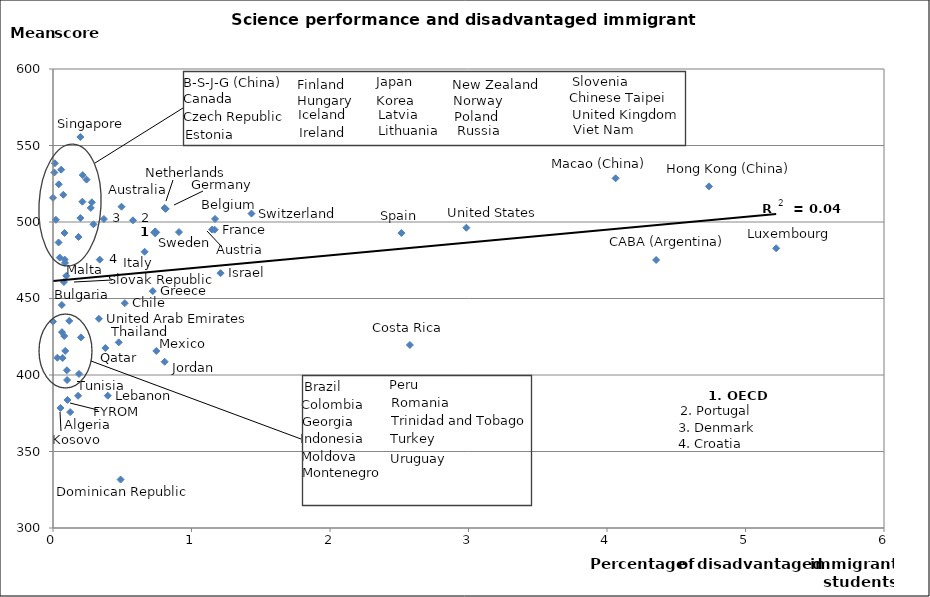
| Category | Series 0 |
|---|---|
| 0.7381021138976486 | 493.202 |
| 4.35471046002874 | 475.187 |
| 2.5767576199304703 | 419.608 |
| 0.9095095076684601 | 493.422 |
| 0.06359937555044999 | 445.772 |
| 0.0 | 434.898 |
| 0.80623082235673 | 408.669 |
| 5.22148431821229 | 482.806 |
| 0.04176187090346 | 524.645 |
| 0.11736489298019999 | 435.363 |
| 0.020934362074009998 | 501.435 |
| 2.9844963956779 | 496.242 |
| 0.29222999618618 | 498.481 |
| 0.51858185506878 | 446.956 |
| 0.36761572163273 | 501.937 |
| 0.04852194694502 | 476.748 |
| 0.66143154133983 | 480.547 |
| 0.08280448093446 | 492.83 |
| 0.49473007744346 | 509.994 |
| 0.07437952162546 | 517.779 |
| 0.08122676642809999 | 425.49 |
| 0.06970216039591 | 411.132 |
| 0.00965815717508 | 532.347 |
| 0.74584816593733 | 415.71 |
| 0.57730181029622 | 501.1 |
| 0.08677356591692001 | 473.23 |
| 0.04017116998308 | 486.631 |
| 0.0 | 515.81 |
| 4.73608688012086 | 523.277 |
| 0.37821854099259 | 417.611 |
| 0.013530713437959998 | 538.395 |
| 1.1700713989834801 | 502 |
| 1.20983840891144 | 466.553 |
| 0.20161467815215 | 424.59 |
| 0.33719584344535003 | 475.391 |
| 0.08414910997898 | 475.409 |
| 0.10459900304424 | 383.682 |
| 0.33158588221089 | 436.731 |
| 0.03144474262489 | 411.314 |
| 0.12379241536725 | 375.745 |
| 0.19766707392210003 | 502.575 |
| 0.10035803336328 | 403.1 |
| 0.7205082191152701 | 454.829 |
| 0.21214077397373998 | 513.304 |
| 0.0884296790826 | 415.729 |
| 0.18108866019997 | 386.403 |
| 0.1018179314471 | 396.684 |
| 4.06195384054908 | 528.55 |
| 2.51554867279658 | 492.786 |
| 1.43298755009549 | 505.506 |
| 0.09540810330846 | 464.782 |
| 0.05927150370932 | 534.194 |
| 0.39540658171751997 | 386.485 |
| 0.48802588145827996 | 331.639 |
| 0.8136493582028901 | 508.575 |
| 0.80553450078663 | 509.141 |
| 0.19742025745795 | 555.575 |
| 0.07887851589781 | 460.775 |
| 1.14895184004248 | 495.037 |
| 0.24217299675145 | 527.705 |
| 0.27285003581611 | 509.222 |
| 0.28044135953187 | 512.864 |
| 1.16737779220244 | 494.978 |
| 0.18777890605073 | 400.682 |
| 0.053829179191470004 | 378.442 |
| 0.21439241269011 | 530.661 |
| 0.47448451473144004 | 421.337 |
| 0.18427034778884 | 490.225 |
| 0.06481070784555 | 427.998 |
| 0.38367885901713 | 432.596 |